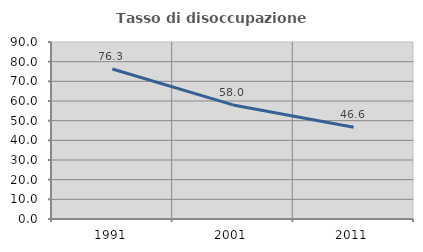
| Category | Tasso di disoccupazione giovanile  |
|---|---|
| 1991.0 | 76.272 |
| 2001.0 | 58.003 |
| 2011.0 | 46.602 |